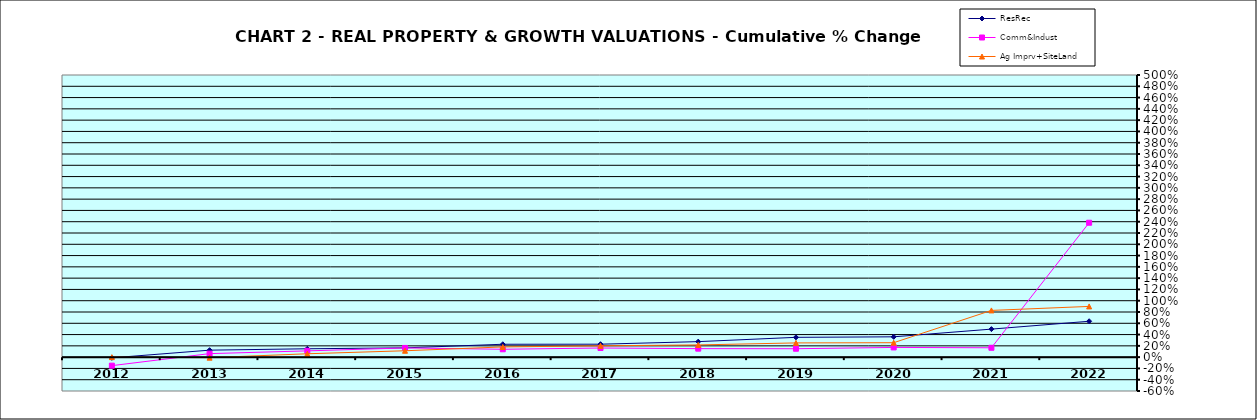
| Category | ResRec | Comm&Indust | Ag Imprv+SiteLand |
|---|---|---|---|
| 2012.0 | -0.013 | -0.151 | 0 |
| 2013.0 | 0.124 | 0.062 | -0.009 |
| 2014.0 | 0.148 | 0.111 | 0.06 |
| 2015.0 | 0.165 | 0.163 | 0.113 |
| 2016.0 | 0.228 | 0.139 | 0.181 |
| 2017.0 | 0.23 | 0.162 | 0.201 |
| 2018.0 | 0.275 | 0.15 | 0.217 |
| 2019.0 | 0.351 | 0.149 | 0.252 |
| 2020.0 | 0.36 | 0.172 | 0.256 |
| 2021.0 | 0.497 | 0.166 | 0.828 |
| 2022.0 | 0.636 | 2.382 | 0.899 |